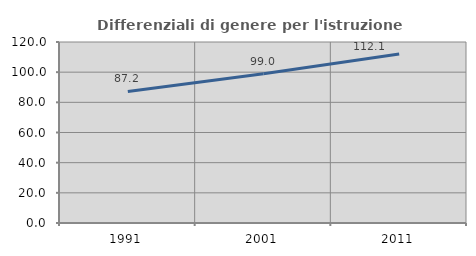
| Category | Differenziali di genere per l'istruzione superiore |
|---|---|
| 1991.0 | 87.221 |
| 2001.0 | 98.997 |
| 2011.0 | 112.069 |